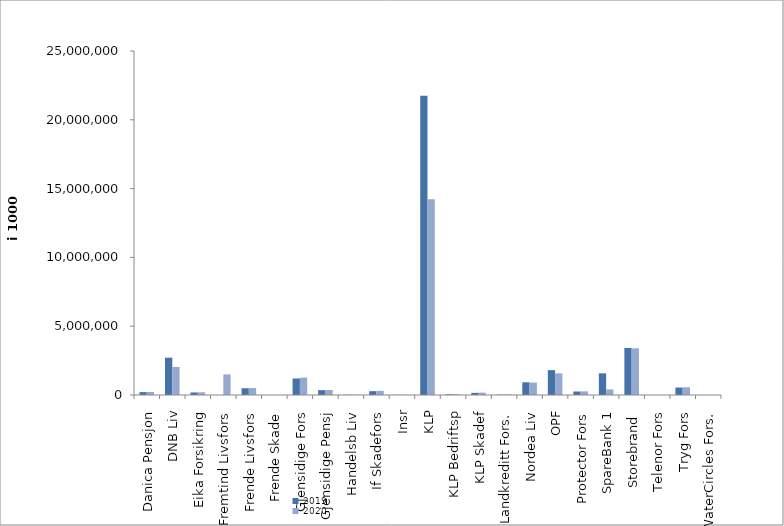
| Category | 2019 | 2020 |
|---|---|---|
| Danica Pensjon | 211735.833 | 216417.99 |
| DNB Liv | 2712593.457 | 2034045.995 |
| Eika Forsikring | 185587 | 196946 |
| Fremtind Livsfors | 0 | 1494137.587 |
| Frende Livsfors | 491921 | 505403 |
| Frende Skade | 1977 | 622.013 |
| Gjensidige Fors | 1200340 | 1264393 |
| Gjensidige Pensj | 350587.6 | 362148.4 |
| Handelsb Liv | 18102 | 17644.03 |
| If Skadefors | 278836.821 | 301902.741 |
| Insr | 9667.001 | 8168 |
| KLP | 21744313.455 | 14225527.383 |
| KLP Bedriftsp | 47990 | 50104 |
| KLP Skadef | 154391 | 173861.997 |
| Landkreditt Fors. | 26907 | 36699 |
| Nordea Liv | 924775.235 | 903440.008 |
| OPF | 1806904 | 1571000 |
| Protector Fors | 254608.636 | 263606.182 |
| SpareBank 1 | 1574350.091 | 405824.042 |
| Storebrand  | 3421913.84 | 3394274.729 |
| Telenor Fors | 0 | 0 |
| Tryg Fors | 543064 | 558832.357 |
| WaterCircles Fors. | 0 | 1120 |